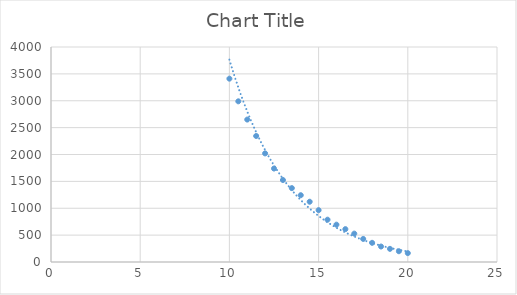
| Category | Series 0 |
|---|---|
| 20.0 | 165.34 |
| 19.5 | 200.17 |
| 19.0 | 244.61 |
| 18.5 | 287.92 |
| 18.0 | 356.76 |
| 17.5 | 429.15 |
| 17.0 | 528.21 |
| 16.5 | 611.47 |
| 16.0 | 694.42 |
| 15.5 | 787.32 |
| 15.0 | 964.38 |
| 14.5 | 1121.06 |
| 14.0 | 1242.72 |
| 13.5 | 1374.62 |
| 13.0 | 1525.17 |
| 12.5 | 1738.82 |
| 12.0 | 2020.45 |
| 11.5 | 2344.38 |
| 11.0 | 2649.91 |
| 10.5 | 2989.34 |
| 10.0 | 3411 |